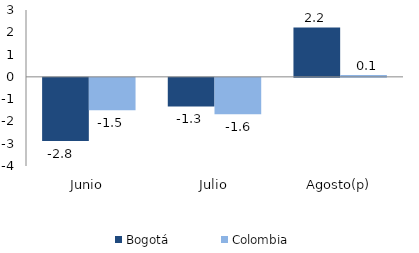
| Category | Bogotá | Colombia |
|---|---|---|
| Junio | -2.829 | -1.45 |
| Julio | -1.282 | -1.629 |
| Agosto(p) | 2.218 | 0.08 |